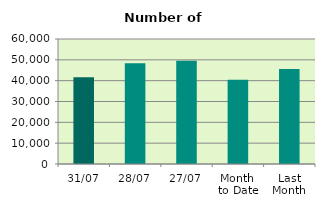
| Category | Series 0 |
|---|---|
| 31/07 | 41602 |
| 28/07 | 48418 |
| 27/07 | 49522 |
| Month 
to Date | 40410.857 |
| Last
Month | 45645.364 |